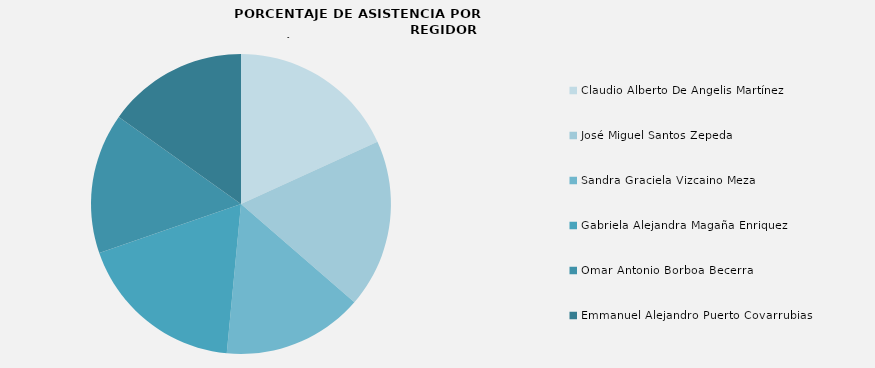
| Category | Series 0 |
|---|---|
| Claudio Alberto De Angelis Martínez | 100 |
| José Miguel Santos Zepeda | 100 |
| Sandra Graciela Vizcaino Meza | 83.333 |
| Gabriela Alejandra Magaña Enriquez | 100 |
| Omar Antonio Borboa Becerra | 83.333 |
| Emmanuel Alejandro Puerto Covarrubias | 83.333 |